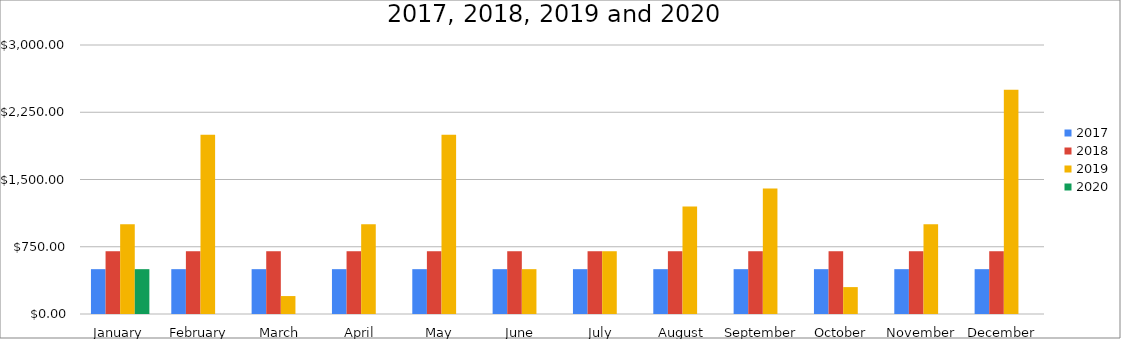
| Category | 2017 | 2018 | 2019 | 2020 |
|---|---|---|---|---|
| January | 500 | 700 | 1000 | 500 |
| February | 500 | 700 | 2000 | 0 |
| March | 500 | 700 | 200 | 0 |
| April | 500 | 700 | 1000 | 0 |
| May | 500 | 700 | 2000 | 0 |
| June | 500 | 700 | 500 | 0 |
| July | 500 | 700 | 700 | 0 |
| August | 500 | 700 | 1200 | 0 |
| September | 500 | 700 | 1400 | 0 |
| October | 500 | 700 | 300 | 0 |
| November | 500 | 700 | 1000 | 0 |
| December | 500 | 700 | 2500 | 0 |